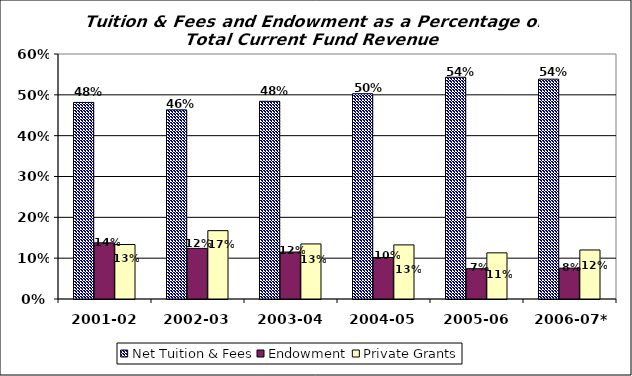
| Category | Net Tuition & Fees | Endowment | Private Grants |
|---|---|---|---|
| 2001-02 | 0.481 | 0.138 | 0.133 |
| 2002-03 | 0.463 | 0.124 | 0.167 |
| 2003-04 | 0.484 | 0.115 | 0.135 |
| 2004-05 | 0.503 | 0.102 | 0.133 |
| 2005-06 | 0.543 | 0.074 | 0.113 |
| 2006-07* | 0.538 | 0.076 | 0.12 |